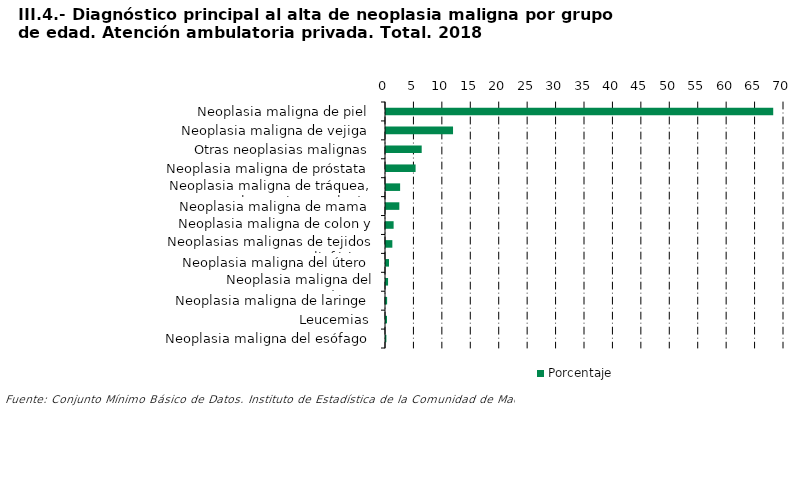
| Category | Porcentaje |
|---|---|
| Neoplasia maligna de piel | 68.104 |
| Neoplasia maligna de vejiga | 11.79 |
| Otras neoplasias malignas | 6.279 |
| Neoplasia maligna de próstata | 5.204 |
| Neoplasia maligna de tráquea, bronquios y pulmón | 2.484 |
| Neoplasia maligna de mama | 2.344 |
| Neoplasia maligna de colon y recto | 1.339 |
| Neoplasias malignas de tejidos linfáticos | 1.116 |
| Neoplasia maligna del útero | 0.53 |
| Neoplasia maligna del estómago | 0.363 |
| Neoplasia maligna de laringe | 0.195 |
| Leucemias | 0.181 |
| Neoplasia maligna del esófago | 0.07 |